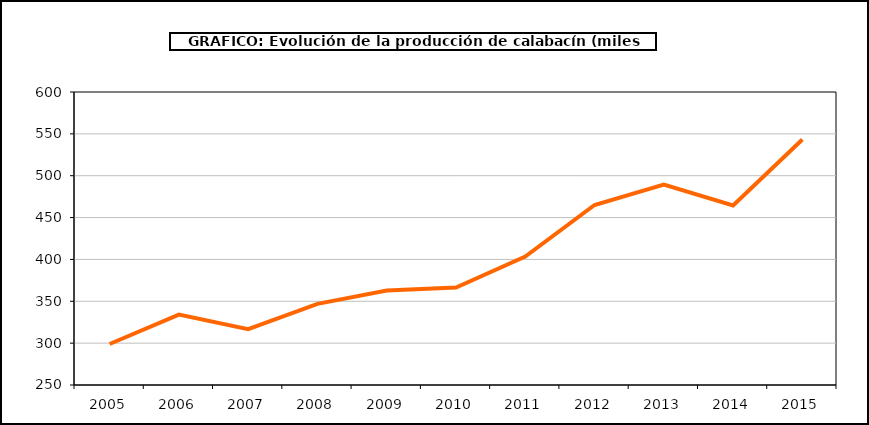
| Category | producción |
|---|---|
| 2005.0 | 298.961 |
| 2006.0 | 334.043 |
| 2007.0 | 316.725 |
| 2008.0 | 346.959 |
| 2009.0 | 362.773 |
| 2010.0 | 366.498 |
| 2011.0 | 403.38 |
| 2012.0 | 465.039 |
| 2013.0 | 489.297 |
| 2014.0 | 464.496 |
| 2015.0 | 543.195 |